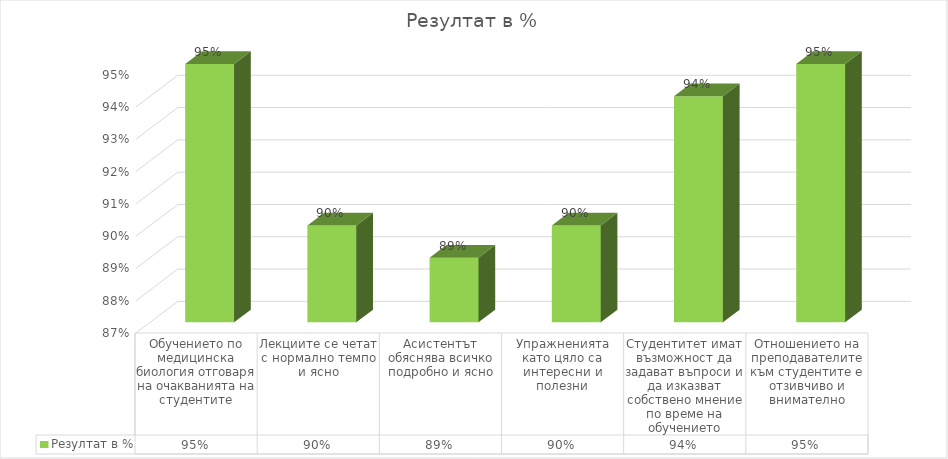
| Category | Резултат в % |
|---|---|
| Обучението по медицинска биология отговаря на очакванията на студентите | 0.95 |
| Лекциите се четат с нормално темпо и ясно | 0.9 |
| Асистентът обяснява всичко подробно и ясно | 0.89 |
| Упражненията като цяло са интересни и полезни | 0.9 |
| Студентитет имат възможност да задават въпроси и да изказват собствено мнение по време на обучението | 0.94 |
| Отношението на преподавателите към студентите е отзивчиво и внимателно | 0.95 |